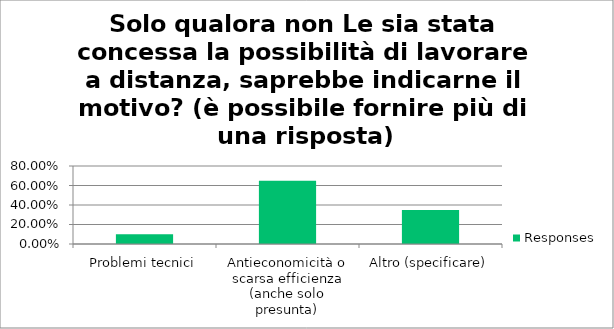
| Category | Responses |
|---|---|
| Problemi tecnici | 0.1 |
| Antieconomicità o scarsa efficienza (anche solo presunta) | 0.65 |
| Altro (specificare) | 0.35 |